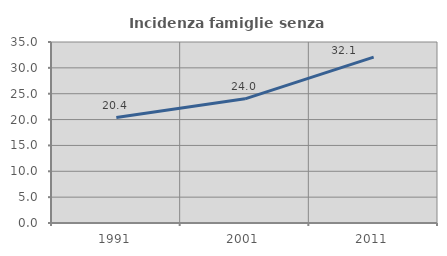
| Category | Incidenza famiglie senza nuclei |
|---|---|
| 1991.0 | 20.387 |
| 2001.0 | 24.015 |
| 2011.0 | 32.066 |